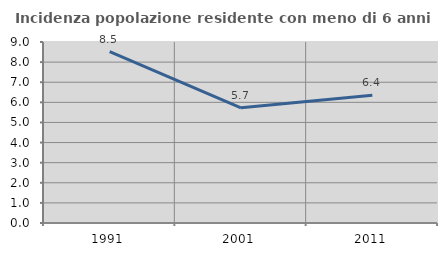
| Category | Incidenza popolazione residente con meno di 6 anni |
|---|---|
| 1991.0 | 8.526 |
| 2001.0 | 5.726 |
| 2011.0 | 6.351 |